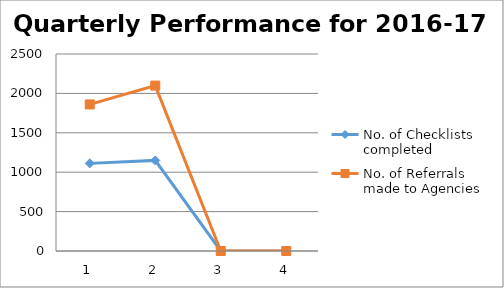
| Category | No. of Checklists completed | No. of Referrals made to Agencies |
|---|---|---|
| 0 | 1112 | 1860 |
| 1 | 1150 | 2099 |
| 2 | 0 | 0 |
| 3 | 0 | 0 |